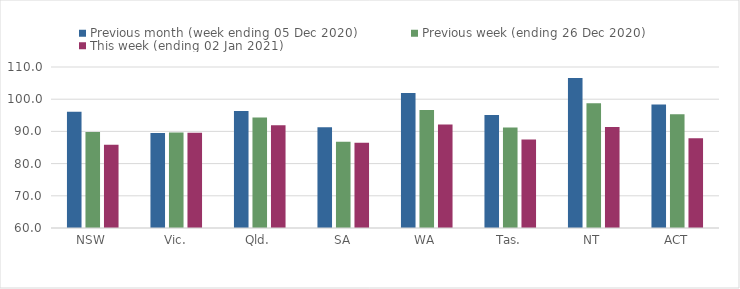
| Category | Previous month (week ending 05 Dec 2020) | Previous week (ending 26 Dec 2020) | This week (ending 02 Jan 2021) |
|---|---|---|---|
| NSW | 96.11 | 89.79 | 85.88 |
| Vic. | 89.53 | 89.62 | 89.57 |
| Qld. | 96.35 | 94.33 | 91.88 |
| SA | 91.27 | 86.78 | 86.46 |
| WA | 101.94 | 96.62 | 92.14 |
| Tas. | 95.11 | 91.25 | 87.51 |
| NT | 106.58 | 98.78 | 91.36 |
| ACT | 98.33 | 95.29 | 87.86 |